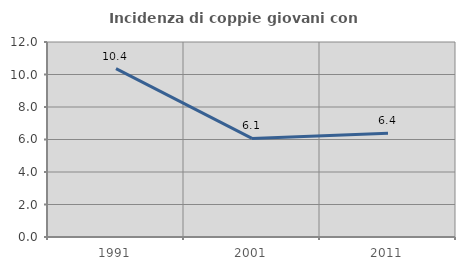
| Category | Incidenza di coppie giovani con figli |
|---|---|
| 1991.0 | 10.364 |
| 2001.0 | 6.066 |
| 2011.0 | 6.389 |